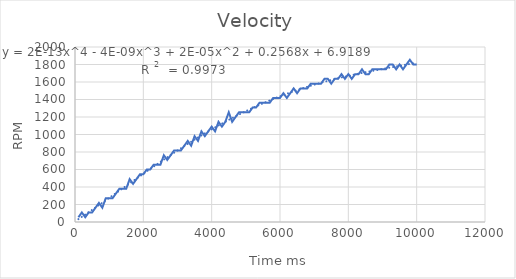
| Category | Series 0 |
|---|---|
| 100.0 | 54 |
| 200.0 | 109 |
| 300.0 | 54 |
| 400.0 | 109 |
| 500.0 | 109 |
| 600.0 | 163 |
| 700.0 | 218 |
| 800.0 | 163 |
| 900.0 | 272 |
| 1000.0 | 272 |
| 1100.0 | 272 |
| 1200.0 | 327 |
| 1300.0 | 381 |
| 1400.0 | 381 |
| 1500.0 | 381 |
| 1600.0 | 490 |
| 1700.0 | 436 |
| 1800.0 | 490 |
| 1900.0 | 545 |
| 2000.0 | 545 |
| 2100.0 | 600 |
| 2200.0 | 600 |
| 2300.0 | 654 |
| 2400.0 | 654 |
| 2500.0 | 654 |
| 2600.0 | 763 |
| 2700.0 | 709 |
| 2800.0 | 763 |
| 2900.0 | 818 |
| 3000.0 | 818 |
| 3100.0 | 818 |
| 3200.0 | 872 |
| 3300.0 | 927 |
| 3400.0 | 872 |
| 3500.0 | 981 |
| 3600.0 | 927 |
| 3700.0 | 1036 |
| 3800.0 | 981 |
| 3900.0 | 1036 |
| 4000.0 | 1090 |
| 4100.0 | 1036 |
| 4200.0 | 1145 |
| 4300.0 | 1090 |
| 4400.0 | 1145 |
| 4500.0 | 1254 |
| 4600.0 | 1145 |
| 4700.0 | 1200 |
| 4800.0 | 1254 |
| 4900.0 | 1254 |
| 5000.0 | 1254 |
| 5100.0 | 1254 |
| 5200.0 | 1309 |
| 5300.0 | 1309 |
| 5400.0 | 1363 |
| 5500.0 | 1363 |
| 5600.0 | 1363 |
| 5700.0 | 1363 |
| 5800.0 | 1418 |
| 5900.0 | 1418 |
| 6000.0 | 1418 |
| 6100.0 | 1472 |
| 6200.0 | 1418 |
| 6300.0 | 1472 |
| 6400.0 | 1527 |
| 6500.0 | 1472 |
| 6600.0 | 1527 |
| 6700.0 | 1527 |
| 6800.0 | 1527 |
| 6900.0 | 1581 |
| 7000.0 | 1581 |
| 7100.0 | 1581 |
| 7200.0 | 1581 |
| 7300.0 | 1636 |
| 7400.0 | 1636 |
| 7500.0 | 1581 |
| 7600.0 | 1636 |
| 7700.0 | 1636 |
| 7800.0 | 1690 |
| 7900.0 | 1636 |
| 8000.0 | 1690 |
| 8100.0 | 1636 |
| 8200.0 | 1690 |
| 8300.0 | 1690 |
| 8400.0 | 1745 |
| 8500.0 | 1690 |
| 8600.0 | 1690 |
| 8700.0 | 1745 |
| 8800.0 | 1745 |
| 8900.0 | 1745 |
| 9000.0 | 1745 |
| 9100.0 | 1745 |
| 9200.0 | 1800 |
| 9300.0 | 1800 |
| 9400.0 | 1745 |
| 9500.0 | 1800 |
| 9600.0 | 1745 |
| 9700.0 | 1800 |
| 9800.0 | 1854 |
| 9900.0 | 1800 |
| 10000.0 | 1800 |